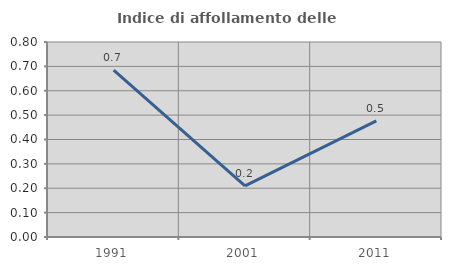
| Category | Indice di affollamento delle abitazioni  |
|---|---|
| 1991.0 | 0.685 |
| 2001.0 | 0.209 |
| 2011.0 | 0.476 |